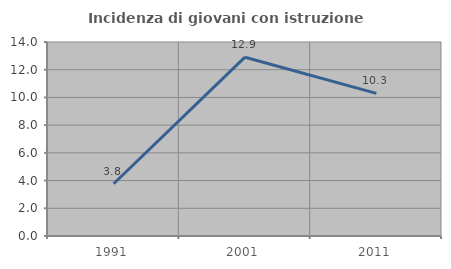
| Category | Incidenza di giovani con istruzione universitaria |
|---|---|
| 1991.0 | 3.774 |
| 2001.0 | 12.903 |
| 2011.0 | 10.294 |